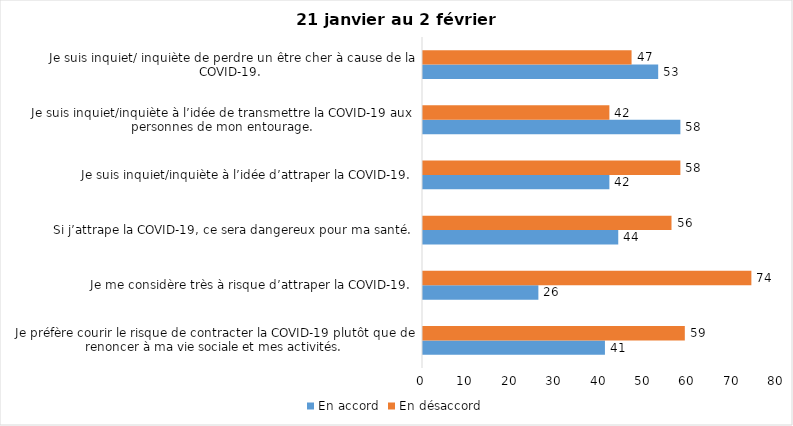
| Category | En accord | En désaccord |
|---|---|---|
| Je préfère courir le risque de contracter la COVID-19 plutôt que de renoncer à ma vie sociale et mes activités. | 41 | 59 |
| Je me considère très à risque d’attraper la COVID-19. | 26 | 74 |
| Si j’attrape la COVID-19, ce sera dangereux pour ma santé. | 44 | 56 |
| Je suis inquiet/inquiète à l’idée d’attraper la COVID-19. | 42 | 58 |
| Je suis inquiet/inquiète à l’idée de transmettre la COVID-19 aux personnes de mon entourage. | 58 | 42 |
| Je suis inquiet/ inquiète de perdre un être cher à cause de la COVID-19. | 53 | 47 |